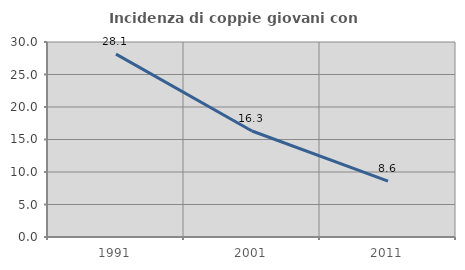
| Category | Incidenza di coppie giovani con figli |
|---|---|
| 1991.0 | 28.137 |
| 2001.0 | 16.312 |
| 2011.0 | 8.599 |